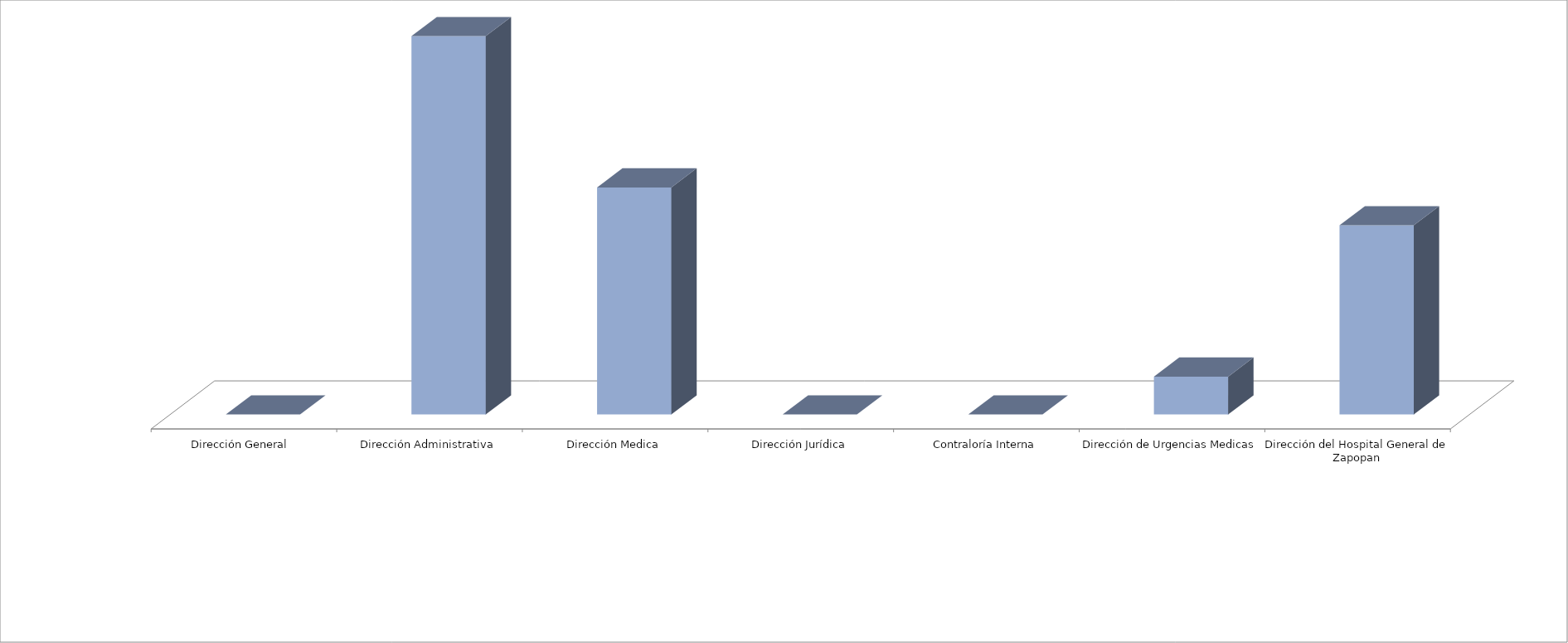
| Category | Series 0 | Series 1 |
|---|---|---|
| Dirección General  |  | 0 |
| Dirección Administrativa |  | 10 |
| Dirección Medica |  | 6 |
| Dirección Jurídica |  | 0 |
| Contraloría Interna |  | 0 |
| Dirección de Urgencias Medicas |  | 1 |
| Dirección del Hospital General de Zapopan |  | 5 |